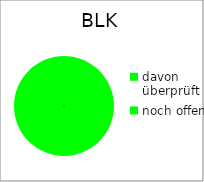
| Category | BLK |
|---|---|
| davon überprüft | 8 |
| noch offen | 0 |